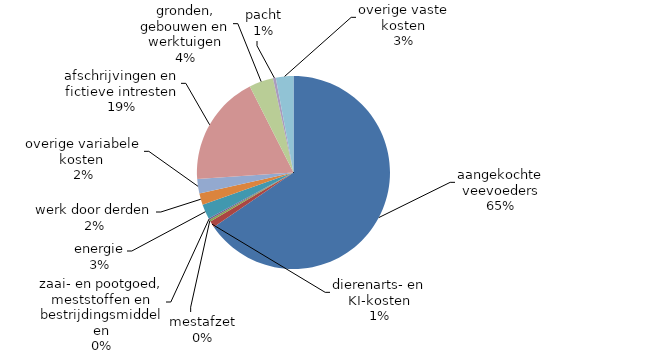
| Category | Series 4 |
|---|---|
| aangekochte veevoeders | 575007.483 |
| dierenarts- en KI-kosten | 9369.182 |
| mestafzet | 2878.724 |
| zaai- en pootgoed, meststoffen en bestrijdingsmiddelen | 2048.589 |
| energie | 21793.077 |
| werk door derden | 16792.224 |
| overige variabele kosten  | 21554.136 |
| afschrijvingen en fictieve intresten | 163278.739 |
| gronden, gebouwen en werktuigen | 35573.528 |
| pacht | 4213.779 |
| overige vaste kosten | 25799.211 |